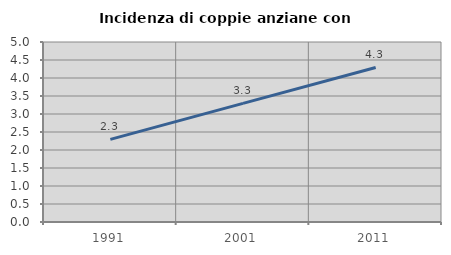
| Category | Incidenza di coppie anziane con figli |
|---|---|
| 1991.0 | 2.296 |
| 2001.0 | 3.295 |
| 2011.0 | 4.294 |